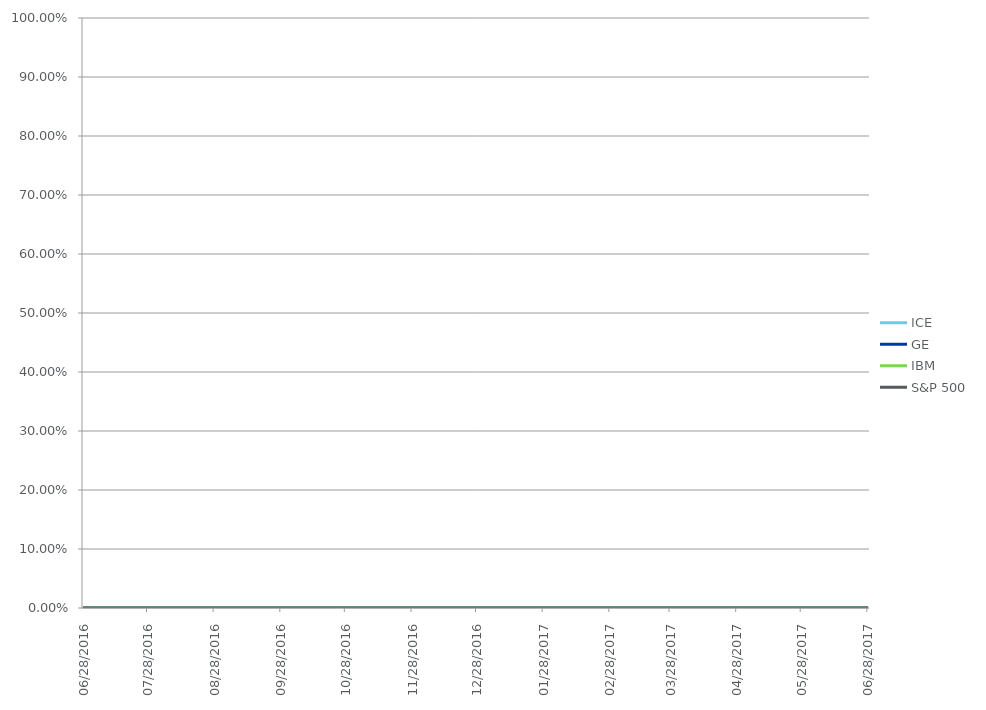
| Category | ICE | GE | IBM | S&P 500 |
|---|---|---|---|---|
| 06/28/2017 | 0 | 0 | 0 | 0 |
| 06/27/2017 | 0 | 0 | 0 | 0 |
| 06/26/2017 | 0 | 0 | 0 | 0 |
| 06/23/2017 | 0 | 0 | 0 | 0 |
| 06/22/2017 | 0 | 0 | 0 | 0 |
| 06/21/2017 | 0 | 0 | 0 | 0 |
| 06/20/2017 | 0 | 0 | 0 | 0 |
| 06/19/2017 | 0 | 0 | 0 | 0 |
| 06/16/2017 | 0 | 0 | 0 | 0 |
| 06/15/2017 | 0 | 0 | 0 | 0 |
| 06/14/2017 | 0 | 0 | 0 | 0 |
| 06/13/2017 | 0 | 0 | 0 | 0 |
| 06/12/2017 | 0 | 0 | 0 | 0 |
| 06/09/2017 | 0 | 0 | 0 | 0 |
| 06/08/2017 | 0 | 0 | 0 | 0 |
| 06/07/2017 | 0 | 0 | 0 | 0 |
| 06/06/2017 | 0 | 0 | 0 | 0 |
| 06/05/2017 | 0 | 0 | 0 | 0 |
| 06/02/2017 | 0 | 0 | 0 | 0 |
| 06/01/2017 | 0 | 0 | 0 | 0 |
| 05/31/2017 | 0 | 0 | 0 | 0 |
| 05/30/2017 | 0 | 0 | 0 | 0 |
| 05/26/2017 | 0 | 0 | 0 | 0 |
| 05/25/2017 | 0 | 0 | 0 | 0 |
| 05/24/2017 | 0 | 0 | 0 | 0 |
| 05/23/2017 | 0 | 0 | 0 | 0 |
| 05/22/2017 | 0 | 0 | 0 | 0 |
| 05/19/2017 | 0 | 0 | 0 | 0 |
| 05/18/2017 | 0 | 0 | 0 | 0 |
| 05/17/2017 | 0 | 0 | 0 | 0 |
| 05/16/2017 | 0 | 0 | 0 | 0 |
| 05/15/2017 | 0 | 0 | 0 | 0 |
| 05/12/2017 | 0 | 0 | 0 | 0 |
| 05/11/2017 | 0 | 0 | 0 | 0 |
| 05/10/2017 | 0 | 0 | 0 | 0 |
| 05/09/2017 | 0 | 0 | 0 | 0 |
| 05/08/2017 | 0 | 0 | 0 | 0 |
| 05/05/2017 | 0 | 0 | 0 | 0 |
| 05/04/2017 | 0 | 0 | 0 | 0 |
| 05/03/2017 | 0 | 0 | 0 | 0 |
| 05/02/2017 | 0 | 0 | 0 | 0 |
| 05/01/2017 | 0 | 0 | 0 | 0 |
| 04/28/2017 | 0 | 0 | 0 | 0 |
| 04/27/2017 | 0 | 0 | 0 | 0 |
| 04/26/2017 | 0 | 0 | 0 | 0 |
| 04/25/2017 | 0 | 0 | 0 | 0 |
| 04/24/2017 | 0 | 0 | 0 | 0 |
| 04/21/2017 | 0 | 0 | 0 | 0 |
| 04/20/2017 | 0 | 0 | 0 | 0 |
| 04/19/2017 | 0 | 0 | 0 | 0 |
| 04/18/2017 | 0 | 0 | 0 | 0 |
| 04/17/2017 | 0 | 0 | 0 | 0 |
| 04/13/2017 | 0 | 0 | 0 | 0 |
| 04/12/2017 | 0 | 0 | 0 | 0 |
| 04/11/2017 | 0 | 0 | 0 | 0 |
| 04/10/2017 | 0 | 0 | 0 | 0 |
| 04/07/2017 | 0 | 0 | 0 | 0 |
| 04/06/2017 | 0 | 0 | 0 | 0 |
| 04/05/2017 | 0 | 0 | 0 | 0 |
| 04/04/2017 | 0 | 0 | 0 | 0 |
| 04/03/2017 | 0 | 0 | 0 | 0 |
| 03/31/2017 | 0 | 0 | 0 | 0 |
| 03/30/2017 | 0 | 0 | 0 | 0 |
| 03/29/2017 | 0 | 0 | 0 | 0 |
| 03/28/2017 | 0 | 0 | 0 | 0 |
| 03/27/2017 | 0 | 0 | 0 | 0 |
| 03/24/2017 | 0 | 0 | 0 | 0 |
| 03/23/2017 | 0 | 0 | 0 | 0 |
| 03/22/2017 | 0 | 0 | 0 | 0 |
| 03/21/2017 | 0 | 0 | 0 | 0 |
| 03/20/2017 | 0 | 0 | 0 | 0 |
| 03/17/2017 | 0 | 0 | 0 | 0 |
| 03/16/2017 | 0 | 0 | 0 | 0 |
| 03/15/2017 | 0 | 0 | 0 | 0 |
| 03/14/2017 | 0 | 0 | 0 | 0 |
| 03/13/2017 | 0 | 0 | 0 | 0 |
| 03/10/2017 | 0 | 0 | 0 | 0 |
| 03/09/2017 | 0 | 0 | 0 | 0 |
| 03/08/2017 | 0 | 0 | 0 | 0 |
| 03/07/2017 | 0 | 0 | 0 | 0 |
| 03/06/2017 | 0 | 0 | 0 | 0 |
| 03/03/2017 | 0 | 0 | 0 | 0 |
| 03/02/2017 | 0 | 0 | 0 | 0 |
| 03/01/2017 | 0 | 0 | 0 | 0 |
| 02/28/2017 | 0 | 0 | 0 | 0 |
| 02/27/2017 | 0 | 0 | 0 | 0 |
| 02/24/2017 | 0 | 0 | 0 | 0 |
| 02/23/2017 | 0 | 0 | 0 | 0 |
| 02/22/2017 | 0 | 0 | 0 | 0 |
| 02/21/2017 | 0 | 0 | 0 | 0 |
| 02/17/2017 | 0 | 0 | 0 | 0 |
| 02/16/2017 | 0 | 0 | 0 | 0 |
| 02/15/2017 | 0 | 0 | 0 | 0 |
| 02/14/2017 | 0 | 0 | 0 | 0 |
| 02/13/2017 | 0 | 0 | 0 | 0 |
| 02/10/2017 | 0 | 0 | 0 | 0 |
| 02/09/2017 | 0 | 0 | 0 | 0 |
| 02/08/2017 | 0 | 0 | 0 | 0 |
| 02/07/2017 | 0 | 0 | 0 | 0 |
| 02/06/2017 | 0 | 0 | 0 | 0 |
| 02/03/2017 | 0 | 0 | 0 | 0 |
| 02/02/2017 | 0 | 0 | 0 | 0 |
| 02/01/2017 | 0 | 0 | 0 | 0 |
| 01/31/2017 | 0 | 0 | 0 | 0 |
| 01/30/2017 | 0 | 0 | 0 | 0 |
| 01/27/2017 | 0 | 0 | 0 | 0 |
| 01/26/2017 | 0 | 0 | 0 | 0 |
| 01/25/2017 | 0 | 0 | 0 | 0 |
| 01/24/2017 | 0 | 0 | 0 | 0 |
| 01/23/2017 | 0 | 0 | 0 | 0 |
| 01/20/2017 | 0 | 0 | 0 | 0 |
| 01/19/2017 | 0 | 0 | 0 | 0 |
| 01/18/2017 | 0 | 0 | 0 | 0 |
| 01/17/2017 | 0 | 0 | 0 | 0 |
| 01/13/2017 | 0 | 0 | 0 | 0 |
| 01/12/2017 | 0 | 0 | 0 | 0 |
| 01/11/2017 | 0 | 0 | 0 | 0 |
| 01/10/2017 | 0 | 0 | 0 | 0 |
| 01/09/2017 | 0 | 0 | 0 | 0 |
| 01/06/2017 | 0 | 0 | 0 | 0 |
| 01/05/2017 | 0 | 0 | 0 | 0 |
| 01/04/2017 | 0 | 0 | 0 | 0 |
| 01/03/2017 | 0 | 0 | 0 | 0 |
| 12/30/2016 | 0 | 0 | 0 | 0 |
| 12/29/2016 | 0 | 0 | 0 | 0 |
| 12/28/2016 | 0 | 0 | 0 | 0 |
| 12/27/2016 | 0 | 0 | 0 | 0 |
| 12/23/2016 | 0 | 0 | 0 | 0 |
| 12/22/2016 | 0 | 0 | 0 | 0 |
| 12/21/2016 | 0 | 0 | 0 | 0 |
| 12/20/2016 | 0 | 0 | 0 | 0 |
| 12/19/2016 | 0 | 0 | 0 | 0 |
| 12/16/2016 | 0 | 0 | 0 | 0 |
| 12/15/2016 | 0 | 0 | 0 | 0 |
| 12/14/2016 | 0 | 0 | 0 | 0 |
| 12/13/2016 | 0 | 0 | 0 | 0 |
| 12/12/2016 | 0 | 0 | 0 | 0 |
| 12/09/2016 | 0 | 0 | 0 | 0 |
| 12/08/2016 | 0 | 0 | 0 | 0 |
| 12/07/2016 | 0 | 0 | 0 | 0 |
| 12/06/2016 | 0 | 0 | 0 | 0 |
| 12/05/2016 | 0 | 0 | 0 | 0 |
| 12/02/2016 | 0 | 0 | 0 | 0 |
| 12/01/2016 | 0 | 0 | 0 | 0 |
| 11/30/2016 | 0 | 0 | 0 | 0 |
| 11/29/2016 | 0 | 0 | 0 | 0 |
| 11/28/2016 | 0 | 0 | 0 | 0 |
| 11/25/2016 | 0 | 0 | 0 | 0 |
| 11/23/2016 | 0 | 0 | 0 | 0 |
| 11/22/2016 | 0 | 0 | 0 | 0 |
| 11/21/2016 | 0 | 0 | 0 | 0 |
| 11/18/2016 | 0 | 0 | 0 | 0 |
| 11/17/2016 | 0 | 0 | 0 | 0 |
| 11/16/2016 | 0 | 0 | 0 | 0 |
| 11/15/2016 | 0 | 0 | 0 | 0 |
| 11/14/2016 | 0 | 0 | 0 | 0 |
| 11/11/2016 | 0 | 0 | 0 | 0 |
| 11/10/2016 | 0 | 0 | 0 | 0 |
| 11/09/2016 | 0 | 0 | 0 | 0 |
| 11/08/2016 | 0 | 0 | 0 | 0 |
| 11/07/2016 | 0 | 0 | 0 | 0 |
| 11/04/2016 | 0 | 0 | 0 | 0 |
| 11/03/2016 | 0 | 0 | 0 | 0 |
| 11/02/2016 | 0 | 0 | 0 | 0 |
| 11/01/2016 | 0 | 0 | 0 | 0 |
| 10/31/2016 | 0 | 0 | 0 | 0 |
| 10/28/2016 | 0 | 0 | 0 | 0 |
| 10/27/2016 | 0 | 0 | 0 | 0 |
| 10/26/2016 | 0 | 0 | 0 | 0 |
| 10/25/2016 | 0 | 0 | 0 | 0 |
| 10/24/2016 | 0 | 0 | 0 | 0 |
| 10/21/2016 | 0 | 0 | 0 | 0 |
| 10/20/2016 | 0 | 0 | 0 | 0 |
| 10/19/2016 | 0 | 0 | 0 | 0 |
| 10/18/2016 | 0 | 0 | 0 | 0 |
| 10/17/2016 | 0 | 0 | 0 | 0 |
| 10/14/2016 | 0 | 0 | 0 | 0 |
| 10/13/2016 | 0 | 0 | 0 | 0 |
| 10/12/2016 | 0 | 0 | 0 | 0 |
| 10/11/2016 | 0 | 0 | 0 | 0 |
| 10/10/2016 | 0 | 0 | 0 | 0 |
| 10/07/2016 | 0 | 0 | 0 | 0 |
| 10/06/2016 | 0 | 0 | 0 | 0 |
| 10/05/2016 | 0 | 0 | 0 | 0 |
| 10/04/2016 | 0 | 0 | 0 | 0 |
| 10/03/2016 | 0 | 0 | 0 | 0 |
| 09/30/2016 | 0 | 0 | 0 | 0 |
| 09/29/2016 | 0 | 0 | 0 | 0 |
| 09/28/2016 | 0 | 0 | 0 | 0 |
| 09/27/2016 | 0 | 0 | 0 | 0 |
| 09/26/2016 | 0 | 0 | 0 | 0 |
| 09/23/2016 | 0 | 0 | 0 | 0 |
| 09/22/2016 | 0 | 0 | 0 | 0 |
| 09/21/2016 | 0 | 0 | 0 | 0 |
| 09/20/2016 | 0 | 0 | 0 | 0 |
| 09/19/2016 | 0 | 0 | 0 | 0 |
| 09/16/2016 | 0 | 0 | 0 | 0 |
| 09/15/2016 | 0 | 0 | 0 | 0 |
| 09/14/2016 | 0 | 0 | 0 | 0 |
| 09/13/2016 | 0 | 0 | 0 | 0 |
| 09/12/2016 | 0 | 0 | 0 | 0 |
| 09/09/2016 | 0 | 0 | 0 | 0 |
| 09/08/2016 | 0 | 0 | 0 | 0 |
| 09/07/2016 | 0 | 0 | 0 | 0 |
| 09/06/2016 | 0 | 0 | 0 | 0 |
| 09/02/2016 | 0 | 0 | 0 | 0 |
| 09/01/2016 | 0 | 0 | 0 | 0 |
| 08/31/2016 | 0 | 0 | 0 | 0 |
| 08/30/2016 | 0 | 0 | 0 | 0 |
| 08/29/2016 | 0 | 0 | 0 | 0 |
| 08/26/2016 | 0 | 0 | 0 | 0 |
| 08/25/2016 | 0 | 0 | 0 | 0 |
| 08/24/2016 | 0 | 0 | 0 | 0 |
| 08/23/2016 | 0 | 0 | 0 | 0 |
| 08/22/2016 | 0 | 0 | 0 | 0 |
| 08/19/2016 | 0 | 0 | 0 | 0 |
| 08/18/2016 | 0 | 0 | 0 | 0 |
| 08/17/2016 | 0 | 0 | 0 | 0 |
| 08/16/2016 | 0 | 0 | 0 | 0 |
| 08/15/2016 | 0 | 0 | 0 | 0 |
| 08/12/2016 | 0 | 0 | 0 | 0 |
| 08/11/2016 | 0 | 0 | 0 | 0 |
| 08/10/2016 | 0 | 0 | 0 | 0 |
| 08/09/2016 | 0 | 0 | 0 | 0 |
| 08/08/2016 | 0 | 0 | 0 | 0 |
| 08/05/2016 | 0 | 0 | 0 | 0 |
| 08/04/2016 | 0 | 0 | 0 | 0 |
| 08/03/2016 | 0 | 0 | 0 | 0 |
| 08/02/2016 | 0 | 0 | 0 | 0 |
| 08/01/2016 | 0 | 0 | 0 | 0 |
| 07/29/2016 | 0 | 0 | 0 | 0 |
| 07/28/2016 | 0 | 0 | 0 | 0 |
| 07/27/2016 | 0 | 0 | 0 | 0 |
| 07/26/2016 | 0 | 0 | 0 | 0 |
| 07/25/2016 | 0 | 0 | 0 | 0 |
| 07/22/2016 | 0 | 0 | 0 | 0 |
| 07/21/2016 | 0 | 0 | 0 | 0 |
| 07/20/2016 | 0 | 0 | 0 | 0 |
| 07/19/2016 | 0 | 0 | 0 | 0 |
| 07/18/2016 | 0 | 0 | 0 | 0 |
| 07/15/2016 | 0 | 0 | 0 | 0 |
| 07/14/2016 | 0 | 0 | 0 | 0 |
| 07/13/2016 | 0 | 0 | 0 | 0 |
| 07/12/2016 | 0 | 0 | 0 | 0 |
| 07/11/2016 | 0 | 0 | 0 | 0 |
| 07/08/2016 | 0 | 0 | 0 | 0 |
| 07/07/2016 | 0 | 0 | 0 | 0 |
| 07/06/2016 | 0 | 0 | 0 | 0 |
| 07/05/2016 | 0 | 0 | 0 | 0 |
| 07/01/2016 | 0 | 0 | 0 | 0 |
| 06/30/2016 | 0 | 0 | 0 | 0 |
| 06/29/2016 | 0 | 0 | 0 | 0 |
| 06/28/2016 | 0 | 0 | 0 | 0 |